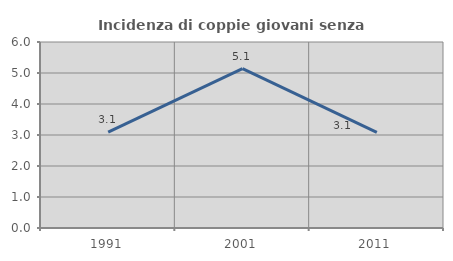
| Category | Incidenza di coppie giovani senza figli |
|---|---|
| 1991.0 | 3.093 |
| 2001.0 | 5.143 |
| 2011.0 | 3.086 |